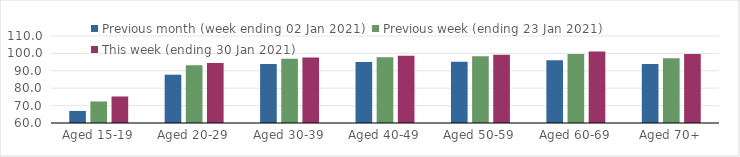
| Category | Previous month (week ending 02 Jan 2021) | Previous week (ending 23 Jan 2021) | This week (ending 30 Jan 2021) |
|---|---|---|---|
| Aged 15-19 | 66.93 | 72.37 | 75.25 |
| Aged 20-29 | 87.77 | 93.23 | 94.5 |
| Aged 30-39 | 93.89 | 96.94 | 97.64 |
| Aged 40-49 | 95.05 | 97.82 | 98.66 |
| Aged 50-59 | 95.18 | 98.33 | 99.29 |
| Aged 60-69 | 96.03 | 99.67 | 101.08 |
| Aged 70+ | 93.97 | 97.27 | 99.65 |